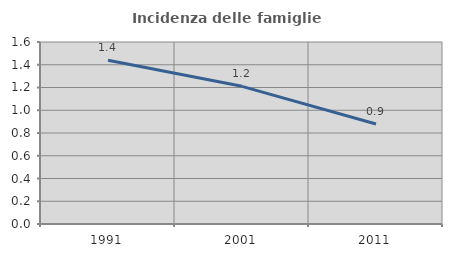
| Category | Incidenza delle famiglie numerose |
|---|---|
| 1991.0 | 1.44 |
| 2001.0 | 1.21 |
| 2011.0 | 0.879 |